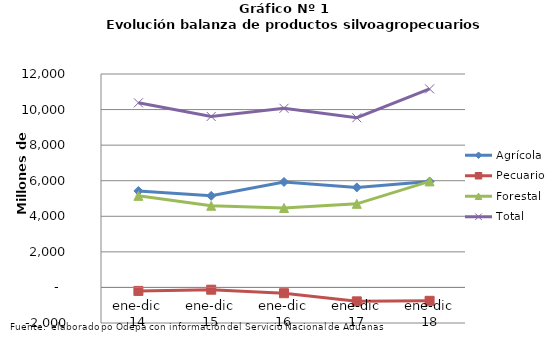
| Category | Agrícola | Pecuario | Forestal | Total |
|---|---|---|---|---|
| ene-dic 14 | 5424524 | -195643 | 5149868 | 10378749 |
| ene-dic 15 | 5149872 | -127785 | 4591408 | 9613495 |
| ene-dic 16 | 5928552 | -325380 | 4468104 | 10071276 |
| ene-dic 17 | 5622747 | -782960 | 4700192 | 9539979 |
| ene-dic 18 | 5953175 | -752809 | 5961336 | 11161702 |